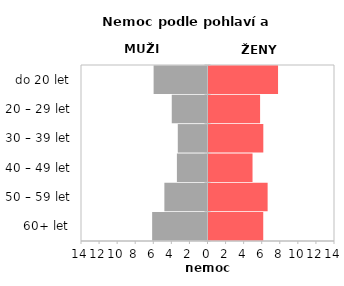
| Category | Nemoc |
|---|---|
| 60+ let | 6.058 |
| 50 – 59 let | 6.543 |
| 40 – 49 let | 4.873 |
| 30 – 39 let | 6.066 |
| 20 – 29 let | 5.71 |
| do 20 let | 7.697 |